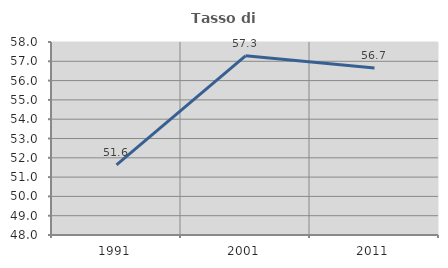
| Category | Tasso di occupazione   |
|---|---|
| 1991.0 | 51.635 |
| 2001.0 | 57.286 |
| 2011.0 | 56.657 |